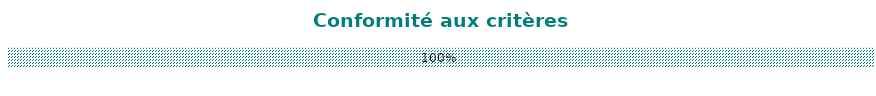
| Category | Conforme | Perfectible | Non conforme | Non concerné | À remplir |
|---|---|---|---|---|---|
| Conformité aux critères d'agrément | 0 | 0 | 0 | 0 | 1 |